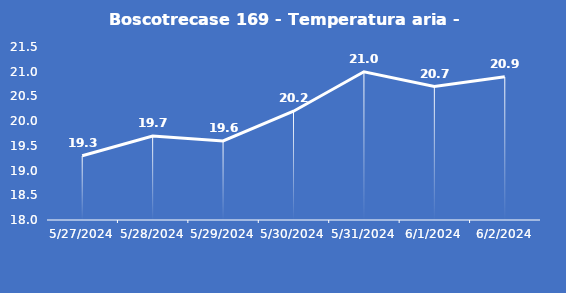
| Category | Boscotrecase 169 - Temperatura aria - Grezzo (°C) |
|---|---|
| 5/27/24 | 19.3 |
| 5/28/24 | 19.7 |
| 5/29/24 | 19.6 |
| 5/30/24 | 20.2 |
| 5/31/24 | 21 |
| 6/1/24 | 20.7 |
| 6/2/24 | 20.9 |